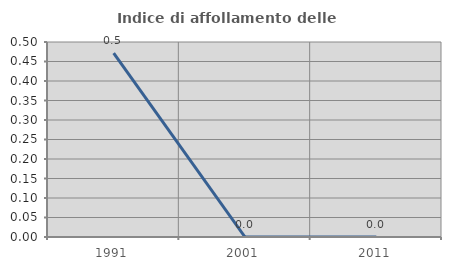
| Category | Indice di affollamento delle abitazioni  |
|---|---|
| 1991.0 | 0.472 |
| 2001.0 | 0 |
| 2011.0 | 0 |